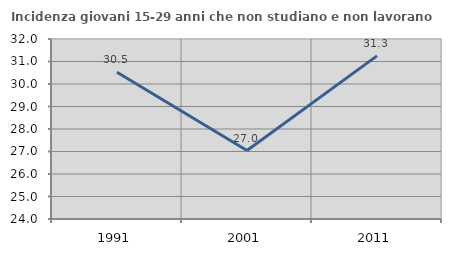
| Category | Incidenza giovani 15-29 anni che non studiano e non lavorano  |
|---|---|
| 1991.0 | 30.522 |
| 2001.0 | 27.044 |
| 2011.0 | 31.25 |